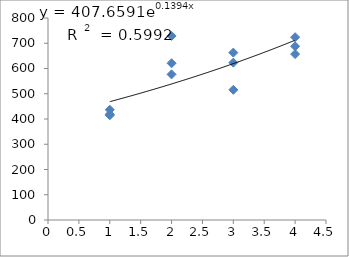
| Category | Series 0 |
|---|---|
| 1.0 | 414.842 |
| 1.0 | 418.793 |
| 1.0 | 436.572 |
| 2.0 | 728.985 |
| 2.0 | 576.779 |
| 2.0 | 620.839 |
| 3.0 | 623.213 |
| 3.0 | 515.567 |
| 3.0 | 662.872 |
| 4.0 | 687.9 |
| 4.0 | 723.97 |
| 4.0 | 656.983 |